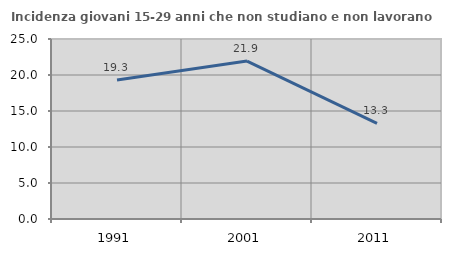
| Category | Incidenza giovani 15-29 anni che non studiano e non lavorano  |
|---|---|
| 1991.0 | 19.317 |
| 2001.0 | 21.93 |
| 2011.0 | 13.281 |